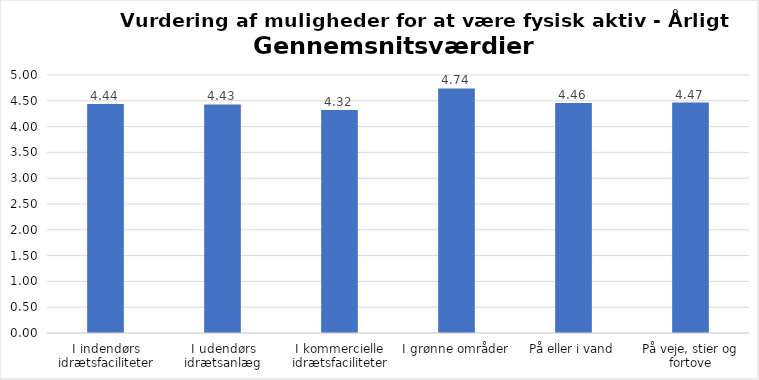
| Category | Gennemsnit |
|---|---|
| I indendørs idrætsfaciliteter | 4.438 |
| I udendørs idrætsanlæg | 4.43 |
| I kommercielle idrætsfaciliteter | 4.323 |
| I grønne områder | 4.741 |
| På eller i vand | 4.46 |
| På veje, stier og fortove | 4.465 |